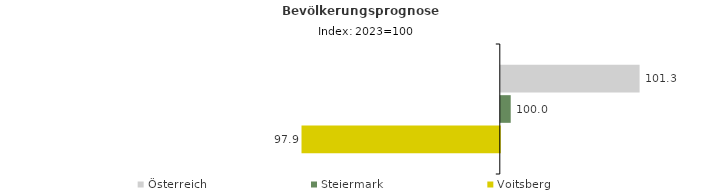
| Category | Österreich | Steiermark | Voitsberg |
|---|---|---|---|
| 2023.0 | 101.3 | 100 | 97.9 |